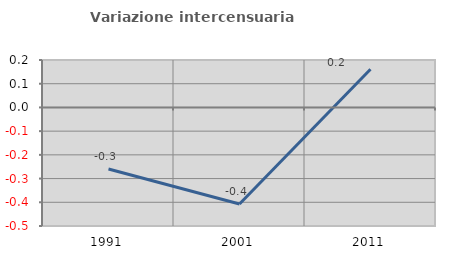
| Category | Variazione intercensuaria annua |
|---|---|
| 1991.0 | -0.259 |
| 2001.0 | -0.407 |
| 2011.0 | 0.161 |